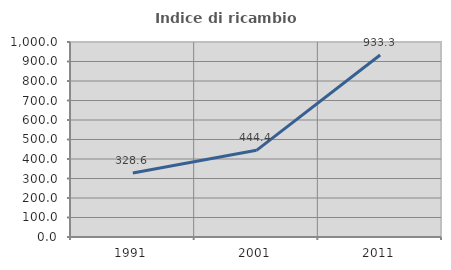
| Category | Indice di ricambio occupazionale  |
|---|---|
| 1991.0 | 328.571 |
| 2001.0 | 444.444 |
| 2011.0 | 933.333 |